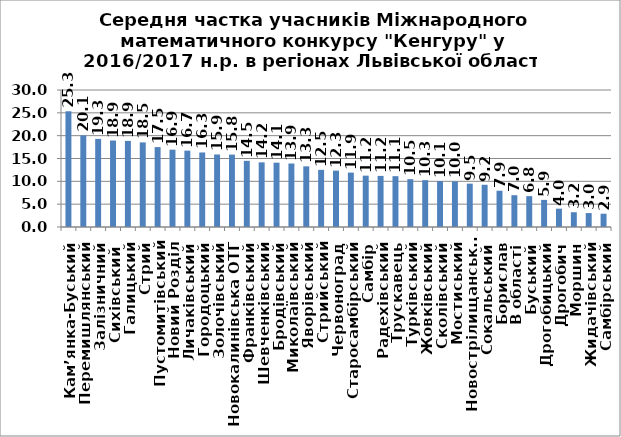
| Category | середній |
|---|---|
| Кам’янка-Буський | 25.344 |
| Перемишлянський | 20.066 |
| Залізничний | 19.293 |
| Сихівський  | 18.934 |
| Галицький | 18.858 |
| Стрий | 18.525 |
| Пустомитівський | 17.498 |
| Новий Розділ | 16.931 |
| Личаківський | 16.726 |
| Городоцький | 16.322 |
| Золочівський | 15.881 |
| Новокалинівська ОТГ | 15.848 |
| Франківський | 14.489 |
| Шевченківський | 14.157 |
| Бродівський | 14.085 |
| Миколаївський | 13.902 |
| Яворівський | 13.28 |
| Стрийський | 12.516 |
| Червоноград | 12.347 |
| Старосамбірський | 11.913 |
| Самбір | 11.243 |
| Радехівський | 11.189 |
| Трускавець | 11.131 |
| Турківський | 10.476 |
| Жовківський | 10.26 |
| Сколівський | 10.064 |
| Мостиський | 9.984 |
| Новострілищанська ОТГ  | 9.494 |
| Сокальський | 9.244 |
| Борислав | 7.944 |
| В області | 6.961 |
| Буський | 6.762 |
| Дрогобицький | 5.938 |
| Дрогобич | 4.012 |
| Моршин | 3.235 |
| Жидачівський | 3.046 |
| Самбірський | 2.909 |